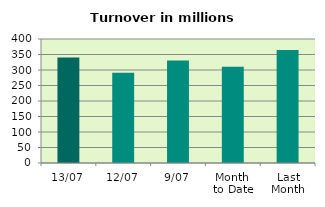
| Category | Series 0 |
|---|---|
| 13/07 | 340.047 |
| 12/07 | 290.996 |
| 9/07 | 330.446 |
| Month 
to Date | 310.249 |
| Last
Month | 364.182 |